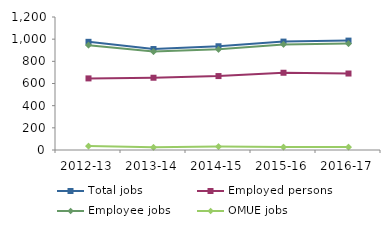
| Category | Total jobs | Employed persons | Employee jobs | OMUE jobs |
|---|---|---|---|---|
| 2012-13 | 976 | 646 | 946 | 35 |
| 2013-14 | 911 | 652 | 888 | 24 |
| 2014-15 | 936 | 667 | 908 | 31 |
| 2015-16 | 978 | 697 | 952 | 26 |
| 2016-17 | 987 | 690 | 960 | 27 |